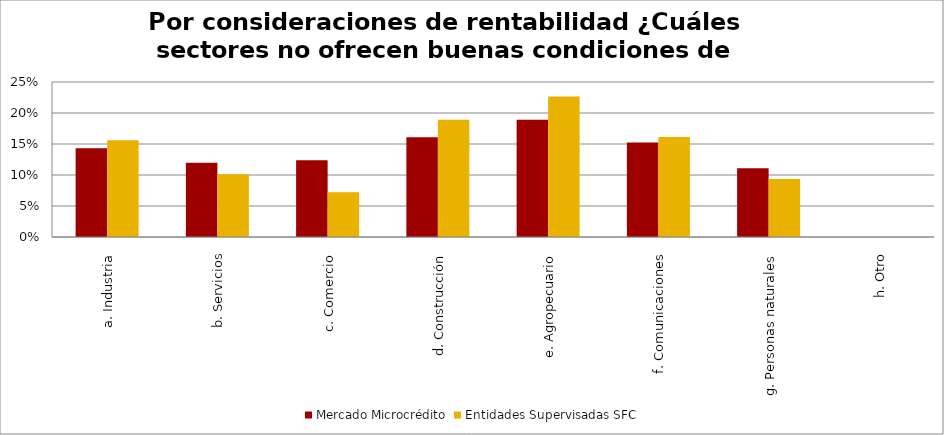
| Category | Mercado Microcrédito | Entidades Supervisadas SFC |
|---|---|---|
| a. Industria | 0.143 | 0.156 |
| b. Servicios | 0.12 | 0.101 |
| c. Comercio | 0.124 | 0.072 |
| d. Construcción | 0.161 | 0.189 |
| e. Agropecuario | 0.189 | 0.226 |
| f. Comunicaciones | 0.152 | 0.161 |
| g. Personas naturales | 0.111 | 0.093 |
| h. Otro | 0 | 0 |